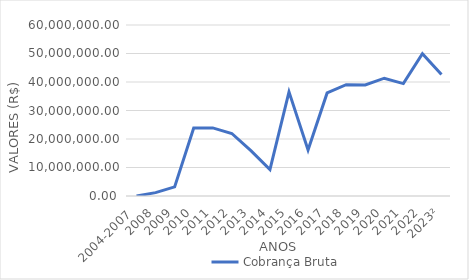
| Category | Cobrança Bruta  |
|---|---|
| 2004-2007  | 0 |
| 2008 | 1189871.05 |
| 2009 | 3204078.39 |
| 2010 | 23881773.74 |
| 2011 | 23892988.67 |
| 2012 | 21932385.61 |
| 2013 | 15907200.53 |
| 2014 | 9278631.17 |
| 2015 | 36540949.37 |
| 2016 | 16164382.11 |
| 2017 | 36166185.78 |
| 2018 | 39073261.86 |
| 2019 | 38969967.88 |
| 2020 | 41333846.89 |
| 2021 | 39445435.57 |
| 2022 | 49926187.51 |
| 2023² | 42595222.42 |